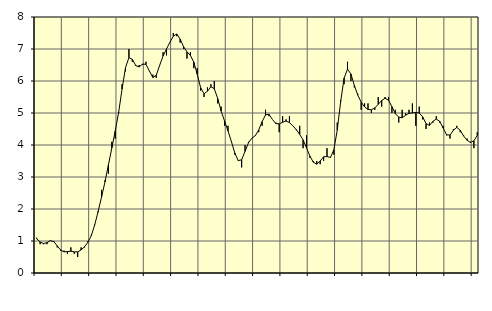
| Category | Piggar | Series 1 |
|---|---|---|
| nan | 1.1 | 1.07 |
| 87.0 | 0.9 | 0.97 |
| 87.0 | 0.9 | 0.92 |
| 87.0 | 0.9 | 0.95 |
| nan | 1 | 1.01 |
| 88.0 | 1 | 0.98 |
| 88.0 | 0.8 | 0.85 |
| 88.0 | 0.7 | 0.72 |
| nan | 0.7 | 0.66 |
| 89.0 | 0.6 | 0.67 |
| 89.0 | 0.8 | 0.68 |
| 89.0 | 0.6 | 0.66 |
| nan | 0.5 | 0.66 |
| 90.0 | 0.8 | 0.72 |
| 90.0 | 0.8 | 0.82 |
| 90.0 | 1 | 0.96 |
| nan | 1.2 | 1.17 |
| 91.0 | 1.5 | 1.51 |
| 91.0 | 1.9 | 1.93 |
| 91.0 | 2.6 | 2.38 |
| nan | 2.9 | 2.85 |
| 92.0 | 3.1 | 3.38 |
| 92.0 | 4.1 | 3.91 |
| 92.0 | 4.2 | 4.44 |
| nan | 5 | 5.03 |
| 93.0 | 5.9 | 5.75 |
| 93.0 | 6.3 | 6.42 |
| 93.0 | 7 | 6.73 |
| nan | 6.6 | 6.68 |
| 94.0 | 6.5 | 6.48 |
| 94.0 | 6.5 | 6.44 |
| 94.0 | 6.5 | 6.53 |
| nan | 6.6 | 6.52 |
| 95.0 | 6.3 | 6.31 |
| 95.0 | 6.2 | 6.11 |
| 95.0 | 6.1 | 6.18 |
| nan | 6.5 | 6.49 |
| 96.0 | 6.9 | 6.78 |
| 96.0 | 6.8 | 7 |
| 96.0 | 7.2 | 7.21 |
| nan | 7.5 | 7.4 |
| 97.0 | 7.4 | 7.47 |
| 97.0 | 7.2 | 7.31 |
| 97.0 | 7 | 7.07 |
| nan | 6.7 | 6.91 |
| 98.0 | 6.9 | 6.8 |
| 98.0 | 6.4 | 6.59 |
| 98.0 | 6.4 | 6.21 |
| nan | 5.7 | 5.79 |
| 99.0 | 5.5 | 5.6 |
| 99.0 | 5.8 | 5.68 |
| 99.0 | 5.9 | 5.82 |
| nan | 6 | 5.76 |
| 0.0 | 5.3 | 5.45 |
| 0.0 | 5.2 | 5.06 |
| 0.0 | 4.6 | 4.75 |
| nan | 4.6 | 4.44 |
| 1.0 | 4.1 | 4.11 |
| 1.0 | 3.7 | 3.75 |
| 1.0 | 3.5 | 3.51 |
| nan | 3.3 | 3.54 |
| 2.0 | 4 | 3.8 |
| 2.0 | 4.1 | 4.07 |
| 2.0 | 4.2 | 4.21 |
| nan | 4.3 | 4.29 |
| 3.0 | 4.4 | 4.47 |
| 3.0 | 4.6 | 4.73 |
| 3.0 | 5.1 | 4.94 |
| nan | 4.9 | 4.96 |
| 4.0 | 4.8 | 4.8 |
| 4.0 | 4.7 | 4.67 |
| 4.0 | 4.4 | 4.66 |
| nan | 4.9 | 4.71 |
| 5.0 | 4.8 | 4.75 |
| 5.0 | 4.9 | 4.7 |
| 5.0 | 4.6 | 4.6 |
| nan | 4.5 | 4.48 |
| 6.0 | 4.6 | 4.33 |
| 6.0 | 3.9 | 4.16 |
| 6.0 | 4.3 | 3.91 |
| nan | 3.6 | 3.65 |
| 7.0 | 3.5 | 3.46 |
| 7.0 | 3.5 | 3.4 |
| 7.0 | 3.4 | 3.5 |
| nan | 3.5 | 3.63 |
| 8.0 | 3.9 | 3.64 |
| 8.0 | 3.6 | 3.61 |
| 8.0 | 3.7 | 3.85 |
| nan | 4.7 | 4.47 |
| 9.0 | 5.4 | 5.36 |
| 9.0 | 5.9 | 6.09 |
| 9.0 | 6.6 | 6.37 |
| nan | 6 | 6.22 |
| 10.0 | 5.8 | 5.86 |
| 10.0 | 5.6 | 5.56 |
| 10.0 | 5.1 | 5.34 |
| nan | 5.3 | 5.19 |
| 11.0 | 5.3 | 5.11 |
| 11.0 | 5 | 5.1 |
| 11.0 | 5.1 | 5.16 |
| nan | 5.5 | 5.27 |
| 12.0 | 5.2 | 5.39 |
| 12.0 | 5.5 | 5.46 |
| 12.0 | 5.5 | 5.4 |
| nan | 5 | 5.2 |
| 13.0 | 5.1 | 4.98 |
| 13.0 | 4.7 | 4.87 |
| 13.0 | 5.1 | 4.85 |
| nan | 5 | 4.93 |
| 14.0 | 5.1 | 4.99 |
| 14.0 | 5.3 | 5 |
| 14.0 | 4.6 | 5.02 |
| nan | 5.2 | 5 |
| 15.0 | 4.8 | 4.88 |
| 15.0 | 4.5 | 4.67 |
| 15.0 | 4.7 | 4.61 |
| nan | 4.7 | 4.74 |
| 16.0 | 4.9 | 4.81 |
| 16.0 | 4.7 | 4.74 |
| 16.0 | 4.6 | 4.53 |
| nan | 4.3 | 4.32 |
| 17.0 | 4.2 | 4.31 |
| 17.0 | 4.5 | 4.46 |
| 17.0 | 4.6 | 4.55 |
| nan | 4.4 | 4.46 |
| 18.0 | 4.3 | 4.28 |
| 18.0 | 4.2 | 4.15 |
| 18.0 | 4.1 | 4.08 |
| nan | 3.9 | 4.13 |
| 19.0 | 4.4 | 4.3 |